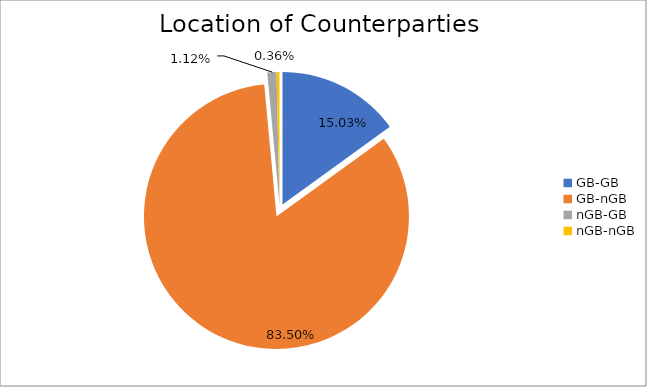
| Category | Series 0 |
|---|---|
| GB-GB | 1451963.084 |
| GB-nGB | 8066970.913 |
| nGB-GB | 107946.954 |
| nGB-nGB | 34565.824 |